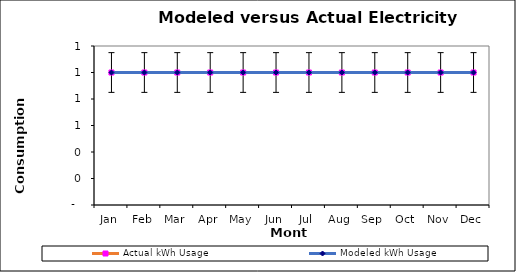
| Category | Actual kWh Usage | Modeled kWh Usage |
|---|---|---|
| 0 | 1 | 1 |
| 1900-01-01 | 1 | 1 |
| 1900-01-02 | 1 | 1 |
| 1900-01-03 | 1 | 1 |
| 1900-01-04 | 1 | 1 |
| 1900-01-05 | 1 | 1 |
| 1900-01-06 | 1 | 1 |
| 1900-01-07 | 1 | 1 |
| 1900-01-08 | 1 | 1 |
| 1900-01-09 | 1 | 1 |
| 1900-01-10 | 1 | 1 |
| 1900-01-11 | 1 | 1 |